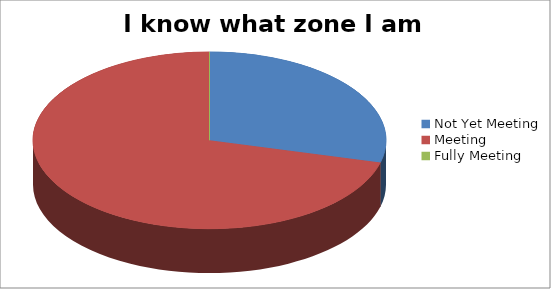
| Category | I know what zone I am in |
|---|---|
| Not Yet Meeting | 9 |
| Meeting | 22 |
| Fully Meeting | 0 |